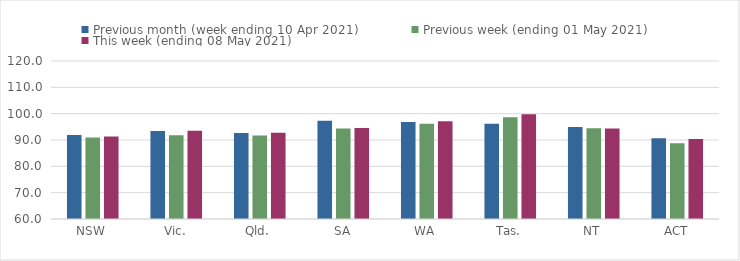
| Category | Previous month (week ending 10 Apr 2021) | Previous week (ending 01 May 2021) | This week (ending 08 May 2021) |
|---|---|---|---|
| NSW | 91.86 | 90.93 | 91.36 |
| Vic. | 93.38 | 91.83 | 93.5 |
| Qld. | 92.64 | 91.71 | 92.75 |
| SA | 97.33 | 94.37 | 94.6 |
| WA | 96.82 | 96.15 | 97.15 |
| Tas. | 96.19 | 98.66 | 99.78 |
| NT | 94.92 | 94.46 | 94.41 |
| ACT | 90.65 | 88.77 | 90.35 |